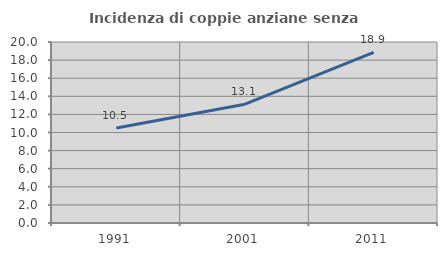
| Category | Incidenza di coppie anziane senza figli  |
|---|---|
| 1991.0 | 10.505 |
| 2001.0 | 13.127 |
| 2011.0 | 18.865 |